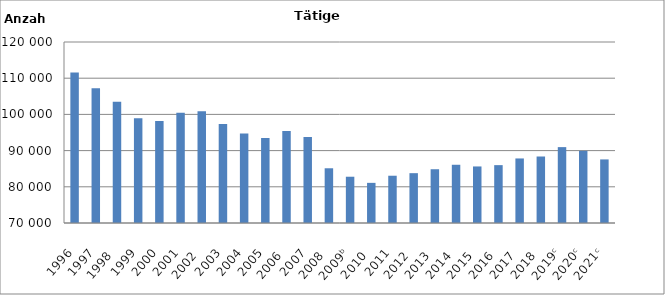
| Category | Series 0 |
|---|---|
| 1996 | 111544 |
| 1997 | 107253 |
| 1998  | 103463 |
| 1999 | 98926 |
| 2000 | 98154 |
| 2001 | 100422 |
| 2002  | 100868 |
| 2003 | 97367 |
| 2004 | 94725 |
| 2005 | 93496 |
| 2006  | 95427 |
| 2007 | 93755 |
| 2008  | 85118 |
| 2009ᵇ | 82782 |
| 2010  | 81089 |
| 2011 | 83058 |
| 2012  | 83766 |
| 2013  | 84853 |
| 2014  | 86087 |
| 2015  | 85622 |
| 2016  | 85986 |
| 2017  | 87831 |
| 2018  | 88371 |
| 2019ᶜ | 90961 |
| 2020ᶜ | 89928 |
| 2021ᶜ | 87564 |